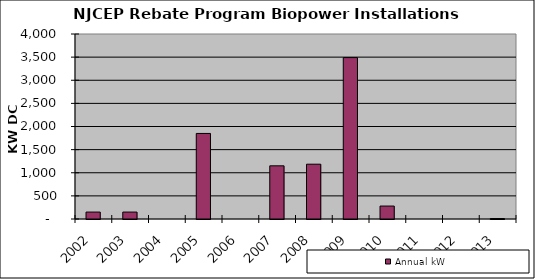
| Category | Annual kW |
|---|---|
| 2002.0 | 150 |
| 2003.0 | 150 |
| 2004.0 | 0 |
| 2005.0 | 1850 |
| 2006.0 | 0 |
| 2007.0 | 1150 |
| 2008.0 | 1185 |
| 2009.0 | 3490 |
| 2010.0 | 280 |
| 2011.0 | 0 |
| 2012.0 | 0 |
| 2013.0 | 10 |